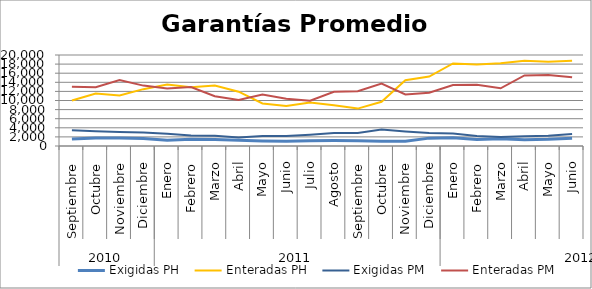
| Category | Exigidas PH | Enteradas PH | Exigidas PM | Enteradas PM |
|---|---|---|---|---|
| 0 | 1528.048 | 9989.528 | 3482.397 | 13040.893 |
| 1 | 1765.671 | 11522.563 | 3249.678 | 12931.878 |
| 2 | 1744.818 | 11123.372 | 3083.204 | 14519.409 |
| 3 | 1659.203 | 12493.623 | 2971.808 | 13273.812 |
| 4 | 1282.931 | 13511.197 | 2715.795 | 12631.271 |
| 5 | 1469.886 | 12912.935 | 2313.398 | 12967.84 |
| 6 | 1451.049 | 13292.147 | 2234.5 | 10944.124 |
| 7 | 1243.266 | 11940.059 | 1876.192 | 10106.188 |
| 8 | 1094.477 | 9346.935 | 2211.516 | 11309.35 |
| 9 | 1038.181 | 8772.488 | 2185.859 | 10360.845 |
| 10 | 1150.33 | 9583.522 | 2484.933 | 9954.534 |
| 11 | 1204.945 | 8947.225 | 2874.347 | 11912.953 |
| 12 | 1181.135 | 8218.837 | 2868.226 | 12046.458 |
| 13 | 1047.181 | 9725.758 | 3619.145 | 13704.352 |
| 14 | 1067.214 | 14456.861 | 3177.175 | 11327.495 |
| 15 | 1729.716 | 15271.717 | 2830.669 | 11719.895 |
| 16 | 1828.564 | 18155.583 | 2744.93 | 13413.991 |
| 17 | 1451.155 | 17917.734 | 2215.902 | 13440.832 |
| 18 | 1587.31 | 18166.129 | 1968.766 | 12673.714 |
| 19 | 1353.003 | 18741.256 | 2118.782 | 15515.723 |
| 20 | 1464.668 | 18540.927 | 2278.002 | 15625.393 |
| 21 | 1719.43 | 18734.539 | 2626.915 | 15127.903 |